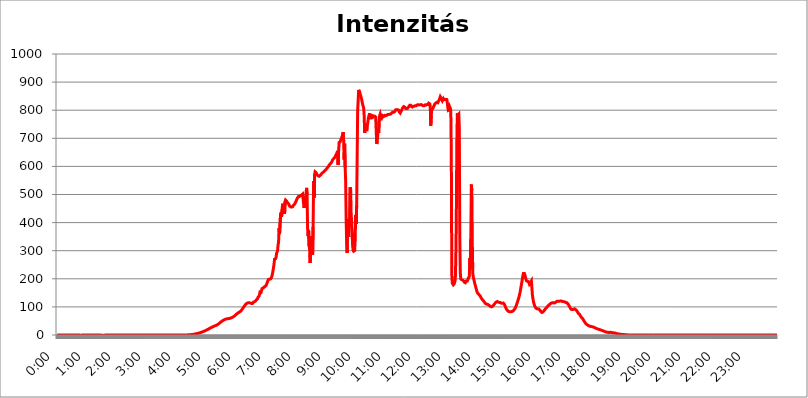
| Category | Intenzitás (W/m2) |
|---|---|
| 0.0 | -0.392 |
| 0.0006944444444444445 | -0.415 |
| 0.001388888888888889 | -0.404 |
| 0.0020833333333333333 | -0.415 |
| 0.002777777777777778 | -0.404 |
| 0.003472222222222222 | -0.381 |
| 0.004166666666666667 | -0.346 |
| 0.004861111111111111 | -0.392 |
| 0.005555555555555556 | -0.335 |
| 0.0062499999999999995 | -0.392 |
| 0.006944444444444444 | -0.415 |
| 0.007638888888888889 | -0.392 |
| 0.008333333333333333 | -0.392 |
| 0.009027777777777779 | -0.358 |
| 0.009722222222222222 | -0.415 |
| 0.010416666666666666 | -0.369 |
| 0.011111111111111112 | -0.404 |
| 0.011805555555555555 | -0.381 |
| 0.012499999999999999 | -0.392 |
| 0.013194444444444444 | -0.404 |
| 0.013888888888888888 | -0.381 |
| 0.014583333333333332 | -0.404 |
| 0.015277777777777777 | -0.427 |
| 0.015972222222222224 | -0.404 |
| 0.016666666666666666 | -0.416 |
| 0.017361111111111112 | -0.45 |
| 0.018055555555555557 | -0.404 |
| 0.01875 | -0.404 |
| 0.019444444444444445 | -0.404 |
| 0.02013888888888889 | -0.416 |
| 0.020833333333333332 | -0.416 |
| 0.02152777777777778 | -0.427 |
| 0.022222222222222223 | -0.404 |
| 0.02291666666666667 | -0.416 |
| 0.02361111111111111 | -0.416 |
| 0.024305555555555556 | -0.427 |
| 0.024999999999999998 | -0.416 |
| 0.025694444444444447 | -0.427 |
| 0.02638888888888889 | -0.439 |
| 0.027083333333333334 | -0.416 |
| 0.027777777777777776 | -0.404 |
| 0.02847222222222222 | -0.427 |
| 0.029166666666666664 | -0.392 |
| 0.029861111111111113 | -0.404 |
| 0.030555555555555555 | -0.427 |
| 0.03125 | -0.462 |
| 0.03194444444444445 | -0.473 |
| 0.03263888888888889 | -0.485 |
| 0.03333333333333333 | -0.462 |
| 0.034027777777777775 | -0.439 |
| 0.034722222222222224 | -0.416 |
| 0.035416666666666666 | -0.404 |
| 0.036111111111111115 | -0.416 |
| 0.03680555555555556 | -0.392 |
| 0.0375 | -0.416 |
| 0.03819444444444444 | -0.404 |
| 0.03888888888888889 | -0.392 |
| 0.03958333333333333 | -0.392 |
| 0.04027777777777778 | -0.392 |
| 0.04097222222222222 | -0.416 |
| 0.041666666666666664 | -0.404 |
| 0.042361111111111106 | -0.381 |
| 0.04305555555555556 | -0.392 |
| 0.043750000000000004 | -0.369 |
| 0.044444444444444446 | -0.416 |
| 0.04513888888888889 | -0.381 |
| 0.04583333333333334 | -0.381 |
| 0.04652777777777778 | -0.392 |
| 0.04722222222222222 | -0.358 |
| 0.04791666666666666 | -0.381 |
| 0.04861111111111111 | -0.369 |
| 0.049305555555555554 | -0.369 |
| 0.049999999999999996 | -0.427 |
| 0.05069444444444445 | -0.392 |
| 0.051388888888888894 | -0.416 |
| 0.052083333333333336 | -0.392 |
| 0.05277777777777778 | -0.404 |
| 0.05347222222222222 | -0.404 |
| 0.05416666666666667 | -0.404 |
| 0.05486111111111111 | -0.392 |
| 0.05555555555555555 | -0.392 |
| 0.05625 | -0.381 |
| 0.05694444444444444 | -0.392 |
| 0.057638888888888885 | -0.381 |
| 0.05833333333333333 | -0.404 |
| 0.05902777777777778 | -0.392 |
| 0.059722222222222225 | -0.427 |
| 0.06041666666666667 | -0.439 |
| 0.061111111111111116 | -0.45 |
| 0.06180555555555556 | -0.462 |
| 0.0625 | -0.519 |
| 0.06319444444444444 | -0.508 |
| 0.06388888888888888 | -0.496 |
| 0.06458333333333334 | -0.473 |
| 0.06527777777777778 | -0.462 |
| 0.06597222222222222 | -0.427 |
| 0.06666666666666667 | -0.439 |
| 0.06736111111111111 | -0.404 |
| 0.06805555555555555 | -0.416 |
| 0.06874999999999999 | -0.462 |
| 0.06944444444444443 | -0.416 |
| 0.07013888888888889 | -0.439 |
| 0.07083333333333333 | -0.404 |
| 0.07152777777777779 | -0.416 |
| 0.07222222222222223 | -0.45 |
| 0.07291666666666667 | -0.45 |
| 0.07361111111111111 | -0.427 |
| 0.07430555555555556 | -0.519 |
| 0.075 | -0.416 |
| 0.07569444444444444 | -0.45 |
| 0.0763888888888889 | -0.45 |
| 0.07708333333333334 | -0.45 |
| 0.07777777777777778 | -0.439 |
| 0.07847222222222222 | -0.427 |
| 0.07916666666666666 | -0.416 |
| 0.0798611111111111 | -0.439 |
| 0.08055555555555556 | -0.404 |
| 0.08125 | -0.45 |
| 0.08194444444444444 | -0.427 |
| 0.08263888888888889 | -0.427 |
| 0.08333333333333333 | -0.427 |
| 0.08402777777777777 | -0.416 |
| 0.08472222222222221 | -0.404 |
| 0.08541666666666665 | -0.404 |
| 0.08611111111111112 | -0.416 |
| 0.08680555555555557 | -0.416 |
| 0.08750000000000001 | -0.427 |
| 0.08819444444444445 | -0.416 |
| 0.08888888888888889 | -0.416 |
| 0.08958333333333333 | -0.427 |
| 0.09027777777777778 | -0.427 |
| 0.09097222222222222 | -0.416 |
| 0.09166666666666667 | -0.416 |
| 0.09236111111111112 | -0.462 |
| 0.09305555555555556 | -0.427 |
| 0.09375 | -0.416 |
| 0.09444444444444444 | -0.416 |
| 0.09513888888888888 | -0.392 |
| 0.09583333333333333 | -0.416 |
| 0.09652777777777777 | -0.416 |
| 0.09722222222222222 | -0.416 |
| 0.09791666666666667 | -0.427 |
| 0.09861111111111111 | -0.427 |
| 0.09930555555555555 | -0.427 |
| 0.09999999999999999 | -0.427 |
| 0.10069444444444443 | -0.439 |
| 0.1013888888888889 | -0.439 |
| 0.10208333333333335 | -0.404 |
| 0.10277777777777779 | -0.416 |
| 0.10347222222222223 | -0.404 |
| 0.10416666666666667 | -0.439 |
| 0.10486111111111111 | -0.427 |
| 0.10555555555555556 | -0.392 |
| 0.10625 | -0.416 |
| 0.10694444444444444 | -0.404 |
| 0.1076388888888889 | -0.358 |
| 0.10833333333333334 | -0.392 |
| 0.10902777777777778 | -0.427 |
| 0.10972222222222222 | -0.369 |
| 0.1111111111111111 | -0.392 |
| 0.11180555555555556 | -0.404 |
| 0.11180555555555556 | -0.416 |
| 0.1125 | -0.439 |
| 0.11319444444444444 | -0.427 |
| 0.11388888888888889 | -0.416 |
| 0.11458333333333333 | -0.335 |
| 0.11527777777777777 | -0.381 |
| 0.11597222222222221 | -0.416 |
| 0.11666666666666665 | -0.369 |
| 0.1173611111111111 | -0.381 |
| 0.11805555555555557 | -0.346 |
| 0.11944444444444445 | -0.358 |
| 0.12013888888888889 | -0.346 |
| 0.12083333333333333 | -0.381 |
| 0.12152777777777778 | -0.358 |
| 0.12222222222222223 | -0.335 |
| 0.12291666666666667 | -0.358 |
| 0.12291666666666667 | -0.381 |
| 0.12361111111111112 | -0.312 |
| 0.12430555555555556 | -0.358 |
| 0.125 | -0.266 |
| 0.12569444444444444 | -0.277 |
| 0.12638888888888888 | -0.3 |
| 0.12708333333333333 | -0.323 |
| 0.16875 | -0.346 |
| 0.12847222222222224 | -0.289 |
| 0.12916666666666668 | -0.335 |
| 0.12986111111111112 | -0.392 |
| 0.13055555555555556 | -0.381 |
| 0.13125 | -0.392 |
| 0.13194444444444445 | -0.369 |
| 0.1326388888888889 | -0.3 |
| 0.13333333333333333 | -0.358 |
| 0.13402777777777777 | -0.369 |
| 0.13402777777777777 | -0.3 |
| 0.13472222222222222 | -0.323 |
| 0.13541666666666666 | -0.289 |
| 0.1361111111111111 | -0.369 |
| 0.13749999999999998 | -0.335 |
| 0.13819444444444443 | -0.323 |
| 0.1388888888888889 | -0.335 |
| 0.13958333333333334 | -0.335 |
| 0.14027777777777778 | -0.335 |
| 0.14097222222222222 | -0.289 |
| 0.14166666666666666 | -0.266 |
| 0.1423611111111111 | -0.3 |
| 0.14305555555555557 | -0.231 |
| 0.14375000000000002 | -0.231 |
| 0.14444444444444446 | -0.277 |
| 0.1451388888888889 | -0.289 |
| 0.1451388888888889 | -0.277 |
| 0.14652777777777778 | -0.254 |
| 0.14722222222222223 | -0.266 |
| 0.14791666666666667 | -0.242 |
| 0.1486111111111111 | -0.231 |
| 0.14930555555555555 | -0.242 |
| 0.15 | -0.242 |
| 0.15069444444444444 | -0.277 |
| 0.15138888888888888 | -0.185 |
| 0.15208333333333332 | -0.219 |
| 0.15277777777777776 | -0.219 |
| 0.15347222222222223 | -0.254 |
| 0.15416666666666667 | -0.162 |
| 0.15486111111111112 | -0.173 |
| 0.15555555555555556 | -0.173 |
| 0.15625 | -0.162 |
| 0.15694444444444444 | -0.15 |
| 0.15763888888888888 | -0.139 |
| 0.15833333333333333 | -0.162 |
| 0.15902777777777777 | -0.208 |
| 0.15972222222222224 | -0.173 |
| 0.16041666666666668 | -0.15 |
| 0.16111111111111112 | -0.185 |
| 0.16180555555555556 | -0.15 |
| 0.1625 | -0.139 |
| 0.16319444444444445 | -0.15 |
| 0.1638888888888889 | -0.173 |
| 0.16458333333333333 | -0.173 |
| 0.16527777777777777 | -0.185 |
| 0.16597222222222222 | -0.139 |
| 0.16666666666666666 | -0.139 |
| 0.1673611111111111 | -0.185 |
| 0.16805555555555554 | -0.15 |
| 0.16874999999999998 | -0.162 |
| 0.16944444444444443 | -0.185 |
| 0.17013888888888887 | -0.127 |
| 0.1708333333333333 | -0.139 |
| 0.17152777777777775 | -0.115 |
| 0.17222222222222225 | -0.104 |
| 0.1729166666666667 | -0.058 |
| 0.17361111111111113 | -0.058 |
| 0.17430555555555557 | -0.023 |
| 0.17500000000000002 | 0.012 |
| 0.17569444444444446 | 0.092 |
| 0.1763888888888889 | 0.046 |
| 0.17708333333333334 | 0.092 |
| 0.17777777777777778 | 0.104 |
| 0.17847222222222223 | 0.219 |
| 0.17916666666666667 | 0.3 |
| 0.1798611111111111 | 0.392 |
| 0.18055555555555555 | 0.416 |
| 0.18125 | 0.508 |
| 0.18194444444444444 | 0.67 |
| 0.1826388888888889 | 0.762 |
| 0.18333333333333335 | 0.831 |
| 0.1840277777777778 | 1.004 |
| 0.18472222222222223 | 1.154 |
| 0.18541666666666667 | 1.304 |
| 0.18611111111111112 | 1.512 |
| 0.18680555555555556 | 1.674 |
| 0.1875 | 1.939 |
| 0.18819444444444444 | 2.274 |
| 0.18888888888888888 | 2.505 |
| 0.18958333333333333 | 2.863 |
| 0.19027777777777777 | 3.117 |
| 0.1909722222222222 | 3.44 |
| 0.19166666666666665 | 3.844 |
| 0.19236111111111112 | 4.19 |
| 0.19305555555555554 | 4.618 |
| 0.19375 | 5.079 |
| 0.19444444444444445 | 5.46 |
| 0.1951388888888889 | 5.934 |
| 0.19583333333333333 | 6.43 |
| 0.19652777777777777 | 6.972 |
| 0.19722222222222222 | 7.492 |
| 0.19791666666666666 | 8.069 |
| 0.1986111111111111 | 8.623 |
| 0.19930555555555554 | 9.235 |
| 0.19999999999999998 | 9.847 |
| 0.20069444444444443 | 10.528 |
| 0.20138888888888887 | 11.221 |
| 0.2020833333333333 | 11.833 |
| 0.2027777777777778 | 12.583 |
| 0.2034722222222222 | 13.299 |
| 0.2041666666666667 | 14.072 |
| 0.20486111111111113 | 14.822 |
| 0.20555555555555557 | 15.677 |
| 0.20625000000000002 | 16.542 |
| 0.20694444444444446 | 17.385 |
| 0.2076388888888889 | 18.274 |
| 0.20833333333333334 | 19.186 |
| 0.20902777777777778 | 20.19 |
| 0.20972222222222223 | 21.218 |
| 0.21041666666666667 | 22.211 |
| 0.2111111111111111 | 23.203 |
| 0.21180555555555555 | 24.173 |
| 0.2125 | 25.166 |
| 0.21319444444444444 | 26.089 |
| 0.2138888888888889 | 26.978 |
| 0.21458333333333335 | 27.879 |
| 0.2152777777777778 | 28.791 |
| 0.21597222222222223 | 29.668 |
| 0.21666666666666667 | 30.511 |
| 0.21736111111111112 | 31.215 |
| 0.21805555555555556 | 31.954 |
| 0.21875 | 32.704 |
| 0.21944444444444444 | 33.408 |
| 0.22013888888888888 | 34.089 |
| 0.22083333333333333 | 34.944 |
| 0.22152777777777777 | 35.798 |
| 0.2222222222222222 | 36.825 |
| 0.22291666666666665 | 37.968 |
| 0.2236111111111111 | 39.203 |
| 0.22430555555555556 | 40.577 |
| 0.225 | 42.101 |
| 0.22569444444444445 | 43.625 |
| 0.2263888888888889 | 45.195 |
| 0.22708333333333333 | 46.696 |
| 0.22777777777777777 | 48.104 |
| 0.22847222222222222 | 49.432 |
| 0.22916666666666666 | 50.574 |
| 0.2298611111111111 | 51.671 |
| 0.23055555555555554 | 52.583 |
| 0.23124999999999998 | 53.529 |
| 0.23194444444444443 | 54.487 |
| 0.23263888888888887 | 55.411 |
| 0.2333333333333333 | 56.184 |
| 0.2340277777777778 | 56.9 |
| 0.2347222222222222 | 57.35 |
| 0.2354166666666667 | 57.719 |
| 0.23611111111111113 | 57.972 |
| 0.23680555555555557 | 58.238 |
| 0.23750000000000002 | 58.457 |
| 0.23819444444444446 | 58.665 |
| 0.2388888888888889 | 58.953 |
| 0.23958333333333334 | 59.346 |
| 0.24027777777777778 | 59.888 |
| 0.24097222222222223 | 60.673 |
| 0.24166666666666667 | 61.492 |
| 0.2423611111111111 | 62.254 |
| 0.24305555555555555 | 63.121 |
| 0.24375 | 64.067 |
| 0.24444444444444446 | 65.106 |
| 0.24513888888888888 | 66.202 |
| 0.24583333333333335 | 67.575 |
| 0.2465277777777778 | 69.203 |
| 0.24722222222222223 | 70.865 |
| 0.24791666666666667 | 72.515 |
| 0.24861111111111112 | 74.212 |
| 0.24930555555555556 | 75.782 |
| 0.25 | 77.11 |
| 0.25069444444444444 | 78.299 |
| 0.2513888888888889 | 79.476 |
| 0.2520833333333333 | 80.722 |
| 0.25277777777777777 | 81.946 |
| 0.2534722222222222 | 83.193 |
| 0.25416666666666665 | 84.59 |
| 0.2548611111111111 | 86.321 |
| 0.2555555555555556 | 88.329 |
| 0.25625000000000003 | 90.696 |
| 0.2569444444444445 | 93.258 |
| 0.2576388888888889 | 95.936 |
| 0.25833333333333336 | 98.51 |
| 0.2590277777777778 | 101.06 |
| 0.25972222222222224 | 103.53 |
| 0.2604166666666667 | 105.97 |
| 0.2611111111111111 | 108.18 |
| 0.26180555555555557 | 110.24 |
| 0.2625 | 111.91 |
| 0.26319444444444445 | 113.15 |
| 0.2638888888888889 | 114.02 |
| 0.26458333333333334 | 114.48 |
| 0.2652777777777778 | 114.68 |
| 0.2659722222222222 | 115.07 |
| 0.26666666666666666 | 114.47 |
| 0.2673611111111111 | 113.83 |
| 0.26805555555555555 | 113.33 |
| 0.26875 | 112.76 |
| 0.26944444444444443 | 112.28 |
| 0.2701388888888889 | 112.09 |
| 0.2708333333333333 | 112.46 |
| 0.27152777777777776 | 113.74 |
| 0.2722222222222222 | 117.12 |
| 0.27291666666666664 | 118.88 |
| 0.2736111111111111 | 118.34 |
| 0.2743055555555555 | 119.53 |
| 0.27499999999999997 | 121.21 |
| 0.27569444444444446 | 123.64 |
| 0.27638888888888885 | 125.64 |
| 0.27708333333333335 | 126.63 |
| 0.2777777777777778 | 128.64 |
| 0.27847222222222223 | 134.72 |
| 0.2791666666666667 | 135.64 |
| 0.2798611111111111 | 137.87 |
| 0.28055555555555556 | 144.87 |
| 0.28125 | 152.84 |
| 0.28194444444444444 | 150.32 |
| 0.2826388888888889 | 151.5 |
| 0.2833333333333333 | 157.41 |
| 0.28402777777777777 | 165.34 |
| 0.2847222222222222 | 167.02 |
| 0.28541666666666665 | 166.76 |
| 0.28611111111111115 | 169.05 |
| 0.28680555555555554 | 170.54 |
| 0.28750000000000003 | 171.5 |
| 0.2881944444444445 | 172.61 |
| 0.2888888888888889 | 173.99 |
| 0.28958333333333336 | 176.02 |
| 0.2902777777777778 | 179.93 |
| 0.29097222222222224 | 185.04 |
| 0.2916666666666667 | 189.7 |
| 0.2923611111111111 | 193.73 |
| 0.29305555555555557 | 198.02 |
| 0.29375 | 199.06 |
| 0.29444444444444445 | 198.76 |
| 0.2951388888888889 | 198.82 |
| 0.29583333333333334 | 199.52 |
| 0.2965277777777778 | 201.4 |
| 0.2972222222222222 | 205.14 |
| 0.29791666666666666 | 211.31 |
| 0.2986111111111111 | 219.38 |
| 0.29930555555555555 | 230.4 |
| 0.3 | 240.1 |
| 0.30069444444444443 | 253.3 |
| 0.3013888888888889 | 270 |
| 0.3020833333333333 | 272.04 |
| 0.30277777777777776 | 271.42 |
| 0.3034722222222222 | 275.51 |
| 0.30416666666666664 | 290.44 |
| 0.3048611111111111 | 294.91 |
| 0.3055555555555555 | 299.32 |
| 0.30624999999999997 | 320.27 |
| 0.3069444444444444 | 329.51 |
| 0.3076388888888889 | 379.46 |
| 0.30833333333333335 | 358.89 |
| 0.3090277777777778 | 355.39 |
| 0.30972222222222223 | 428.57 |
| 0.3104166666666667 | 436.03 |
| 0.3111111111111111 | 420.45 |
| 0.31180555555555556 | 446.61 |
| 0.3125 | 463.15 |
| 0.31319444444444444 | 463.1 |
| 0.3138888888888889 | 462.56 |
| 0.3145833333333333 | 449.44 |
| 0.31527777777777777 | 430.81 |
| 0.3159722222222222 | 474.76 |
| 0.31666666666666665 | 480.55 |
| 0.31736111111111115 | 477.4 |
| 0.31805555555555554 | 476.95 |
| 0.31875000000000003 | 474.49 |
| 0.3194444444444445 | 470.53 |
| 0.3201388888888889 | 469.17 |
| 0.32083333333333336 | 466.94 |
| 0.3215277777777778 | 463.12 |
| 0.32222222222222224 | 458.97 |
| 0.3229166666666667 | 457.09 |
| 0.3236111111111111 | 456.13 |
| 0.32430555555555557 | 455.9 |
| 0.325 | 455.19 |
| 0.32569444444444445 | 455.46 |
| 0.3263888888888889 | 456.52 |
| 0.32708333333333334 | 460.28 |
| 0.3277777777777778 | 461.9 |
| 0.3284722222222222 | 463.36 |
| 0.32916666666666666 | 465.42 |
| 0.3298611111111111 | 468.73 |
| 0.33055555555555555 | 471.76 |
| 0.33125 | 476.09 |
| 0.33194444444444443 | 481.24 |
| 0.3326388888888889 | 484.31 |
| 0.3333333333333333 | 488.85 |
| 0.3340277777777778 | 491.82 |
| 0.3347222222222222 | 492.97 |
| 0.3354166666666667 | 493.38 |
| 0.3361111111111111 | 493.22 |
| 0.3368055555555556 | 494.98 |
| 0.33749999999999997 | 496.55 |
| 0.33819444444444446 | 497.66 |
| 0.33888888888888885 | 498.27 |
| 0.33958333333333335 | 500.15 |
| 0.34027777777777773 | 501.49 |
| 0.34097222222222223 | 499.98 |
| 0.3416666666666666 | 467.49 |
| 0.3423611111111111 | 452.17 |
| 0.3430555555555555 | 465.54 |
| 0.34375 | 483.03 |
| 0.3444444444444445 | 492.57 |
| 0.3451388888888889 | 505.97 |
| 0.3458333333333334 | 523.56 |
| 0.34652777777777777 | 498.74 |
| 0.34722222222222227 | 379.48 |
| 0.34791666666666665 | 352.05 |
| 0.34861111111111115 | 374 |
| 0.34930555555555554 | 317.28 |
| 0.35000000000000003 | 305.08 |
| 0.3506944444444444 | 255.99 |
| 0.3513888888888889 | 301.9 |
| 0.3520833333333333 | 351.03 |
| 0.3527777777777778 | 310.83 |
| 0.3534722222222222 | 296.34 |
| 0.3541666666666667 | 285.21 |
| 0.3548611111111111 | 384.57 |
| 0.35555555555555557 | 548.06 |
| 0.35625 | 488.7 |
| 0.35694444444444445 | 569.87 |
| 0.3576388888888889 | 580.86 |
| 0.35833333333333334 | 581.77 |
| 0.3590277777777778 | 577.94 |
| 0.3597222222222222 | 573.83 |
| 0.36041666666666666 | 569.72 |
| 0.3611111111111111 | 568.73 |
| 0.36180555555555555 | 566.53 |
| 0.3625 | 565.66 |
| 0.36319444444444443 | 564.88 |
| 0.3638888888888889 | 565.95 |
| 0.3645833333333333 | 568.12 |
| 0.3652777777777778 | 570.16 |
| 0.3659722222222222 | 571.95 |
| 0.3666666666666667 | 573.47 |
| 0.3673611111111111 | 575.71 |
| 0.3680555555555556 | 577.52 |
| 0.36874999999999997 | 579.08 |
| 0.36944444444444446 | 580.39 |
| 0.37013888888888885 | 582.05 |
| 0.37083333333333335 | 583.99 |
| 0.37152777777777773 | 585.44 |
| 0.37222222222222223 | 587.41 |
| 0.3729166666666666 | 589.54 |
| 0.3736111111111111 | 592.21 |
| 0.3743055555555555 | 594.38 |
| 0.375 | 596.27 |
| 0.3756944444444445 | 598.24 |
| 0.3763888888888889 | 600.71 |
| 0.3770833333333334 | 604.32 |
| 0.37777777777777777 | 607.32 |
| 0.37847222222222227 | 608.68 |
| 0.37916666666666665 | 610.28 |
| 0.37986111111111115 | 612.41 |
| 0.38055555555555554 | 614.86 |
| 0.38125000000000003 | 618.43 |
| 0.3819444444444444 | 623.18 |
| 0.3826388888888889 | 626.02 |
| 0.3833333333333333 | 627.56 |
| 0.3840277777777778 | 629.48 |
| 0.3847222222222222 | 631.42 |
| 0.3854166666666667 | 635.08 |
| 0.3861111111111111 | 638.91 |
| 0.38680555555555557 | 641.17 |
| 0.3875 | 644.99 |
| 0.38819444444444445 | 648.03 |
| 0.3888888888888889 | 655.29 |
| 0.38958333333333334 | 605.32 |
| 0.3902777777777778 | 656.46 |
| 0.3909722222222222 | 685.35 |
| 0.39166666666666666 | 688.15 |
| 0.3923611111111111 | 686.8 |
| 0.39305555555555555 | 693.53 |
| 0.39375 | 697.72 |
| 0.39444444444444443 | 702.09 |
| 0.3951388888888889 | 707.05 |
| 0.3958333333333333 | 714.28 |
| 0.3965277777777778 | 722.13 |
| 0.3972222222222222 | 692.13 |
| 0.3979166666666667 | 623.55 |
| 0.3986111111111111 | 680.8 |
| 0.3993055555555556 | 595.94 |
| 0.39999999999999997 | 548.93 |
| 0.40069444444444446 | 412.51 |
| 0.40138888888888885 | 325.88 |
| 0.40208333333333335 | 291.73 |
| 0.40277777777777773 | 408.77 |
| 0.40347222222222223 | 413.18 |
| 0.4041666666666666 | 349.59 |
| 0.4048611111111111 | 410.23 |
| 0.4055555555555555 | 384.03 |
| 0.40625 | 525.32 |
| 0.4069444444444445 | 517.41 |
| 0.4076388888888889 | 429.71 |
| 0.4083333333333334 | 405.59 |
| 0.40902777777777777 | 361.99 |
| 0.40972222222222227 | 316.04 |
| 0.41041666666666665 | 302.13 |
| 0.41111111111111115 | 298.26 |
| 0.41180555555555554 | 301.35 |
| 0.41250000000000003 | 300.67 |
| 0.4131944444444444 | 335.1 |
| 0.4138888888888889 | 427.42 |
| 0.4145833333333333 | 395.15 |
| 0.4152777777777778 | 459.97 |
| 0.4159722222222222 | 635.24 |
| 0.4166666666666667 | 799.5 |
| 0.4173611111111111 | 800.08 |
| 0.41805555555555557 | 872.16 |
| 0.41875 | 869.44 |
| 0.41944444444444445 | 864.06 |
| 0.4201388888888889 | 858.21 |
| 0.42083333333333334 | 851.7 |
| 0.4215277777777778 | 845.03 |
| 0.4222222222222222 | 838.22 |
| 0.42291666666666666 | 829.25 |
| 0.4236111111111111 | 820.07 |
| 0.42430555555555555 | 813.96 |
| 0.425 | 807.07 |
| 0.42569444444444443 | 780.69 |
| 0.4263888888888889 | 718.67 |
| 0.4270833333333333 | 751.36 |
| 0.4277777777777778 | 752.85 |
| 0.4284722222222222 | 733.13 |
| 0.4291666666666667 | 725.64 |
| 0.4298611111111111 | 743.29 |
| 0.4305555555555556 | 752.89 |
| 0.43124999999999997 | 766.23 |
| 0.43194444444444446 | 777.62 |
| 0.43263888888888885 | 783.37 |
| 0.43333333333333335 | 789.17 |
| 0.43402777777777773 | 768.24 |
| 0.43472222222222223 | 775.03 |
| 0.4354166666666666 | 784.92 |
| 0.4361111111111111 | 778.33 |
| 0.4368055555555555 | 776.56 |
| 0.4375 | 774.84 |
| 0.4381944444444445 | 776.6 |
| 0.4388888888888889 | 779.49 |
| 0.4395833333333334 | 780.25 |
| 0.44027777777777777 | 778.69 |
| 0.44097222222222227 | 777.32 |
| 0.44166666666666665 | 775.6 |
| 0.44236111111111115 | 729.5 |
| 0.44305555555555554 | 679.79 |
| 0.44375000000000003 | 688.37 |
| 0.4444444444444444 | 708.99 |
| 0.4451388888888889 | 730.92 |
| 0.4458333333333333 | 720.22 |
| 0.4465277777777778 | 766.76 |
| 0.4472222222222222 | 780.59 |
| 0.4479166666666667 | 786.01 |
| 0.4486111111111111 | 777.78 |
| 0.44930555555555557 | 776.4 |
| 0.45 | 771.96 |
| 0.45069444444444445 | 776.12 |
| 0.4513888888888889 | 780.62 |
| 0.45208333333333334 | 779.82 |
| 0.4527777777777778 | 777.78 |
| 0.4534722222222222 | 777.72 |
| 0.45416666666666666 | 781.41 |
| 0.4548611111111111 | 781.91 |
| 0.45555555555555555 | 780.5 |
| 0.45625 | 780.87 |
| 0.45694444444444443 | 782.14 |
| 0.4576388888888889 | 784.34 |
| 0.4583333333333333 | 784.57 |
| 0.4590277777777778 | 783.77 |
| 0.4597222222222222 | 784.94 |
| 0.4604166666666667 | 785.03 |
| 0.4611111111111111 | 785.42 |
| 0.4618055555555556 | 785.59 |
| 0.46249999999999997 | 786.04 |
| 0.46319444444444446 | 786.61 |
| 0.46388888888888885 | 789.74 |
| 0.46458333333333335 | 793.1 |
| 0.46527777777777773 | 793.08 |
| 0.46597222222222223 | 792.46 |
| 0.4666666666666666 | 792.54 |
| 0.4673611111111111 | 793.38 |
| 0.4680555555555555 | 795.24 |
| 0.46875 | 798.11 |
| 0.4694444444444445 | 801.7 |
| 0.4701388888888889 | 801.58 |
| 0.4708333333333334 | 801.48 |
| 0.47152777777777777 | 802.11 |
| 0.47222222222222227 | 802.02 |
| 0.47291666666666665 | 801.51 |
| 0.47361111111111115 | 799.92 |
| 0.47430555555555554 | 794.01 |
| 0.47500000000000003 | 790.57 |
| 0.4756944444444444 | 789.81 |
| 0.4763888888888889 | 792.53 |
| 0.4770833333333333 | 797.52 |
| 0.4777777777777778 | 801.25 |
| 0.4784722222222222 | 804.28 |
| 0.4791666666666667 | 808.77 |
| 0.4798611111111111 | 811.24 |
| 0.48055555555555557 | 812.92 |
| 0.48125 | 812.39 |
| 0.48194444444444445 | 810.69 |
| 0.4826388888888889 | 807.98 |
| 0.48333333333333334 | 806.24 |
| 0.4840277777777778 | 804.72 |
| 0.4847222222222222 | 805.8 |
| 0.48541666666666666 | 807 |
| 0.4861111111111111 | 806.97 |
| 0.48680555555555555 | 809.04 |
| 0.4875 | 812.27 |
| 0.48819444444444443 | 814.8 |
| 0.4888888888888889 | 817.65 |
| 0.4895833333333333 | 817.63 |
| 0.4902777777777778 | 817.6 |
| 0.4909722222222222 | 813.66 |
| 0.4916666666666667 | 810.84 |
| 0.4923611111111111 | 811.22 |
| 0.4930555555555556 | 813.18 |
| 0.49374999999999997 | 813.93 |
| 0.49444444444444446 | 813.73 |
| 0.49513888888888885 | 813.94 |
| 0.49583333333333335 | 814.35 |
| 0.49652777777777773 | 815.96 |
| 0.49722222222222223 | 815.56 |
| 0.4979166666666666 | 815.76 |
| 0.4986111111111111 | 817.25 |
| 0.4993055555555555 | 818.91 |
| 0.5 | 819.7 |
| 0.5006944444444444 | 819.3 |
| 0.5013888888888889 | 818.92 |
| 0.5020833333333333 | 818.78 |
| 0.5027777777777778 | 818.79 |
| 0.5034722222222222 | 819.42 |
| 0.5041666666666667 | 819.71 |
| 0.5048611111111111 | 820.1 |
| 0.5055555555555555 | 819.04 |
| 0.50625 | 817.35 |
| 0.5069444444444444 | 817.28 |
| 0.5076388888888889 | 815.6 |
| 0.5083333333333333 | 814.51 |
| 0.5090277777777777 | 816.06 |
| 0.5097222222222222 | 818.35 |
| 0.5104166666666666 | 819.09 |
| 0.5111111111111112 | 819.75 |
| 0.5118055555555555 | 818.44 |
| 0.5125000000000001 | 820.34 |
| 0.5131944444444444 | 820.62 |
| 0.513888888888889 | 819.52 |
| 0.5145833333333333 | 820.04 |
| 0.5152777777777778 | 824.86 |
| 0.5159722222222222 | 823.76 |
| 0.5166666666666667 | 822.51 |
| 0.517361111111111 | 813.27 |
| 0.5180555555555556 | 744.58 |
| 0.5187499999999999 | 782.14 |
| 0.5194444444444445 | 802.27 |
| 0.5201388888888888 | 803.76 |
| 0.5208333333333334 | 805.71 |
| 0.5215277777777778 | 809.83 |
| 0.5222222222222223 | 813.52 |
| 0.5229166666666667 | 817.88 |
| 0.5236111111111111 | 822.05 |
| 0.5243055555555556 | 824.14 |
| 0.525 | 825.2 |
| 0.5256944444444445 | 826.64 |
| 0.5263888888888889 | 828.03 |
| 0.5270833333333333 | 828.37 |
| 0.5277777777777778 | 826.51 |
| 0.5284722222222222 | 829.5 |
| 0.5291666666666667 | 833.84 |
| 0.5298611111111111 | 837.7 |
| 0.5305555555555556 | 842.62 |
| 0.53125 | 847.99 |
| 0.5319444444444444 | 844.76 |
| 0.5326388888888889 | 841.27 |
| 0.5333333333333333 | 839.7 |
| 0.5340277777777778 | 833.69 |
| 0.5347222222222222 | 836.23 |
| 0.5354166666666667 | 840.9 |
| 0.5361111111111111 | 837.31 |
| 0.5368055555555555 | 839.74 |
| 0.5375 | 838.22 |
| 0.5381944444444444 | 835.55 |
| 0.5388888888888889 | 838.79 |
| 0.5395833333333333 | 840.92 |
| 0.5402777777777777 | 838 |
| 0.5409722222222222 | 828.58 |
| 0.5416666666666666 | 810.35 |
| 0.5423611111111112 | 799.53 |
| 0.5430555555555555 | 802.5 |
| 0.5437500000000001 | 801.19 |
| 0.5444444444444444 | 811.41 |
| 0.545138888888889 | 807.37 |
| 0.5458333333333333 | 798.75 |
| 0.5465277777777778 | 650.01 |
| 0.5472222222222222 | 214.75 |
| 0.5479166666666667 | 184.16 |
| 0.548611111111111 | 183.13 |
| 0.5493055555555556 | 178.53 |
| 0.5499999999999999 | 179.1 |
| 0.5506944444444445 | 182.82 |
| 0.5513888888888888 | 188.54 |
| 0.5520833333333334 | 197.18 |
| 0.5527777777777778 | 272.38 |
| 0.5534722222222223 | 405.87 |
| 0.5541666666666667 | 682.76 |
| 0.5548611111111111 | 789.22 |
| 0.5555555555555556 | 782.72 |
| 0.55625 | 785.63 |
| 0.5569444444444445 | 786.6 |
| 0.5576388888888889 | 740.39 |
| 0.5583333333333333 | 338.72 |
| 0.5590277777777778 | 222.08 |
| 0.5597222222222222 | 198.87 |
| 0.5604166666666667 | 200.05 |
| 0.5611111111111111 | 196.72 |
| 0.5618055555555556 | 194.23 |
| 0.5625 | 194.85 |
| 0.5631944444444444 | 195.09 |
| 0.5638888888888889 | 191.86 |
| 0.5645833333333333 | 187.64 |
| 0.5652777777777778 | 184.62 |
| 0.5659722222222222 | 185.82 |
| 0.5666666666666667 | 188.93 |
| 0.5673611111111111 | 192.24 |
| 0.5680555555555555 | 191.99 |
| 0.56875 | 192.25 |
| 0.5694444444444444 | 196.86 |
| 0.5701388888888889 | 202.27 |
| 0.5708333333333333 | 203.81 |
| 0.5715277777777777 | 208.38 |
| 0.5722222222222222 | 272.97 |
| 0.5729166666666666 | 234.19 |
| 0.5736111111111112 | 340.72 |
| 0.5743055555555555 | 535.61 |
| 0.5750000000000001 | 512.98 |
| 0.5756944444444444 | 324.84 |
| 0.576388888888889 | 218.26 |
| 0.5770833333333333 | 205.1 |
| 0.5777777777777778 | 198.41 |
| 0.5784722222222222 | 189.85 |
| 0.5791666666666667 | 182.71 |
| 0.579861111111111 | 176.55 |
| 0.5805555555555556 | 169.3 |
| 0.5812499999999999 | 162.52 |
| 0.5819444444444445 | 156.32 |
| 0.5826388888888888 | 150.77 |
| 0.5833333333333334 | 147.89 |
| 0.5840277777777778 | 146.42 |
| 0.5847222222222223 | 144.88 |
| 0.5854166666666667 | 142.35 |
| 0.5861111111111111 | 140.31 |
| 0.5868055555555556 | 138.05 |
| 0.5875 | 134.5 |
| 0.5881944444444445 | 130.86 |
| 0.5888888888888889 | 127.92 |
| 0.5895833333333333 | 126.18 |
| 0.5902777777777778 | 124.06 |
| 0.5909722222222222 | 121.75 |
| 0.5916666666666667 | 119.6 |
| 0.5923611111111111 | 117.43 |
| 0.5930555555555556 | 115 |
| 0.59375 | 112.36 |
| 0.5944444444444444 | 110.79 |
| 0.5951388888888889 | 110.16 |
| 0.5958333333333333 | 109.85 |
| 0.5965277777777778 | 109.33 |
| 0.5972222222222222 | 108.48 |
| 0.5979166666666667 | 107.53 |
| 0.5986111111111111 | 106.2 |
| 0.5993055555555555 | 104.77 |
| 0.6 | 103.41 |
| 0.6006944444444444 | 101.92 |
| 0.6013888888888889 | 100.74 |
| 0.6020833333333333 | 100.31 |
| 0.6027777777777777 | 100.66 |
| 0.6034722222222222 | 101.54 |
| 0.6041666666666666 | 102.92 |
| 0.6048611111111112 | 105.13 |
| 0.6055555555555555 | 107.53 |
| 0.6062500000000001 | 109.71 |
| 0.6069444444444444 | 111.88 |
| 0.607638888888889 | 114.1 |
| 0.6083333333333333 | 116 |
| 0.6090277777777778 | 117.6 |
| 0.6097222222222222 | 118.72 |
| 0.6104166666666667 | 119.09 |
| 0.611111111111111 | 118.15 |
| 0.6118055555555556 | 116.62 |
| 0.6124999999999999 | 115.93 |
| 0.6131944444444445 | 115.89 |
| 0.6138888888888888 | 115.79 |
| 0.6145833333333334 | 115.59 |
| 0.6152777777777778 | 114.15 |
| 0.6159722222222223 | 113.3 |
| 0.6166666666666667 | 112.92 |
| 0.6173611111111111 | 113.07 |
| 0.6180555555555556 | 113.45 |
| 0.61875 | 113.61 |
| 0.6194444444444445 | 112.87 |
| 0.6201388888888889 | 109.4 |
| 0.6208333333333333 | 105.3 |
| 0.6215277777777778 | 100.67 |
| 0.6222222222222222 | 96.287 |
| 0.6229166666666667 | 92.6 |
| 0.6236111111111111 | 89.616 |
| 0.6243055555555556 | 87.335 |
| 0.625 | 85.55 |
| 0.6256944444444444 | 84.214 |
| 0.6263888888888889 | 83.42 |
| 0.6270833333333333 | 82.937 |
| 0.6277777777777778 | 82.73 |
| 0.6284722222222222 | 82.765 |
| 0.6291666666666667 | 82.985 |
| 0.6298611111111111 | 83.078 |
| 0.6305555555555555 | 83.298 |
| 0.63125 | 84.059 |
| 0.6319444444444444 | 85.432 |
| 0.6326388888888889 | 86.862 |
| 0.6333333333333333 | 88.799 |
| 0.6340277777777777 | 91.209 |
| 0.6347222222222222 | 93.641 |
| 0.6354166666666666 | 96.777 |
| 0.6361111111111112 | 101.19 |
| 0.6368055555555555 | 106.2 |
| 0.6375000000000001 | 111.65 |
| 0.6381944444444444 | 116.83 |
| 0.638888888888889 | 122.31 |
| 0.6395833333333333 | 128.16 |
| 0.6402777777777778 | 134.13 |
| 0.6409722222222222 | 141.16 |
| 0.6416666666666667 | 149.22 |
| 0.642361111111111 | 158.16 |
| 0.6430555555555556 | 168.56 |
| 0.6437499999999999 | 179.28 |
| 0.6444444444444445 | 189.35 |
| 0.6451388888888888 | 199.8 |
| 0.6458333333333334 | 210.76 |
| 0.6465277777777778 | 219.07 |
| 0.6472222222222223 | 220.74 |
| 0.6479166666666667 | 218.99 |
| 0.6486111111111111 | 215.8 |
| 0.6493055555555556 | 207.21 |
| 0.65 | 198.92 |
| 0.6506944444444445 | 193.29 |
| 0.6513888888888889 | 190.9 |
| 0.6520833333333333 | 190.95 |
| 0.6527777777777778 | 191.55 |
| 0.6534722222222222 | 190.05 |
| 0.6541666666666667 | 186.19 |
| 0.6548611111111111 | 180.91 |
| 0.6555555555555556 | 179.35 |
| 0.65625 | 185.51 |
| 0.6569444444444444 | 188.14 |
| 0.6576388888888889 | 192.2 |
| 0.6583333333333333 | 167.62 |
| 0.6590277777777778 | 142.54 |
| 0.6597222222222222 | 129.92 |
| 0.6604166666666667 | 119.8 |
| 0.6611111111111111 | 112.47 |
| 0.6618055555555555 | 106.6 |
| 0.6625 | 101.7 |
| 0.6631944444444444 | 98.208 |
| 0.6638888888888889 | 95.649 |
| 0.6645833333333333 | 94.07 |
| 0.6652777777777777 | 93.47 |
| 0.6659722222222222 | 93.182 |
| 0.6666666666666666 | 93.009 |
| 0.6673611111111111 | 92.733 |
| 0.6680555555555556 | 92.169 |
| 0.6687500000000001 | 90.866 |
| 0.6694444444444444 | 88.561 |
| 0.6701388888888888 | 85.829 |
| 0.6708333333333334 | 83.247 |
| 0.6715277777777778 | 81.068 |
| 0.6722222222222222 | 80.065 |
| 0.6729166666666666 | 80.503 |
| 0.6736111111111112 | 81.853 |
| 0.6743055555555556 | 83.64 |
| 0.6749999999999999 | 85.819 |
| 0.6756944444444444 | 88.39 |
| 0.6763888888888889 | 91.077 |
| 0.6770833333333334 | 93.43 |
| 0.6777777777777777 | 95.113 |
| 0.6784722222222223 | 96.647 |
| 0.6791666666666667 | 98.814 |
| 0.6798611111111111 | 101.55 |
| 0.6805555555555555 | 103.81 |
| 0.68125 | 104.95 |
| 0.6819444444444445 | 106.25 |
| 0.6826388888888889 | 108.2 |
| 0.6833333333333332 | 110.25 |
| 0.6840277777777778 | 111.59 |
| 0.6847222222222222 | 112.67 |
| 0.6854166666666667 | 113.5 |
| 0.686111111111111 | 114.23 |
| 0.6868055555555556 | 115.01 |
| 0.6875 | 115.17 |
| 0.6881944444444444 | 114.64 |
| 0.688888888888889 | 113.71 |
| 0.6895833333333333 | 113.56 |
| 0.6902777777777778 | 114.54 |
| 0.6909722222222222 | 115.97 |
| 0.6916666666666668 | 117.5 |
| 0.6923611111111111 | 118.89 |
| 0.6930555555555555 | 119.81 |
| 0.69375 | 119.99 |
| 0.6944444444444445 | 119.95 |
| 0.6951388888888889 | 119.93 |
| 0.6958333333333333 | 120.1 |
| 0.6965277777777777 | 120.25 |
| 0.6972222222222223 | 120.63 |
| 0.6979166666666666 | 121.21 |
| 0.6986111111111111 | 121.36 |
| 0.6993055555555556 | 120.47 |
| 0.7000000000000001 | 120.15 |
| 0.7006944444444444 | 119.8 |
| 0.7013888888888888 | 118.87 |
| 0.7020833333333334 | 118.42 |
| 0.7027777777777778 | 118.67 |
| 0.7034722222222222 | 118.35 |
| 0.7041666666666666 | 117.29 |
| 0.7048611111111112 | 116.35 |
| 0.7055555555555556 | 115.51 |
| 0.7062499999999999 | 114.99 |
| 0.7069444444444444 | 114.65 |
| 0.7076388888888889 | 113.27 |
| 0.7083333333333334 | 110.63 |
| 0.7090277777777777 | 107.95 |
| 0.7097222222222223 | 105.04 |
| 0.7104166666666667 | 102.24 |
| 0.7111111111111111 | 98.549 |
| 0.7118055555555555 | 94.295 |
| 0.7125 | 91.585 |
| 0.7131944444444445 | 90.582 |
| 0.7138888888888889 | 90.444 |
| 0.7145833333333332 | 90.547 |
| 0.7152777777777778 | 90.766 |
| 0.7159722222222222 | 91.377 |
| 0.7166666666666667 | 92.623 |
| 0.717361111111111 | 93.142 |
| 0.7180555555555556 | 92.576 |
| 0.71875 | 91.02 |
| 0.7194444444444444 | 89.151 |
| 0.720138888888889 | 87.306 |
| 0.7208333333333333 | 85.116 |
| 0.7215277777777778 | 82.452 |
| 0.7222222222222222 | 79.292 |
| 0.7229166666666668 | 76.456 |
| 0.7236111111111111 | 74.415 |
| 0.7243055555555555 | 73.724 |
| 0.725 | 71.36 |
| 0.7256944444444445 | 67.761 |
| 0.7263888888888889 | 64.867 |
| 0.7270833333333333 | 62.757 |
| 0.7277777777777777 | 61.062 |
| 0.7284722222222223 | 59.24 |
| 0.7291666666666666 | 56.426 |
| 0.7298611111111111 | 53.44 |
| 0.7305555555555556 | 50.315 |
| 0.7312500000000001 | 47.489 |
| 0.7319444444444444 | 44.768 |
| 0.7326388888888888 | 42.139 |
| 0.7333333333333334 | 39.844 |
| 0.7340277777777778 | 38.045 |
| 0.7347222222222222 | 36.696 |
| 0.7354166666666666 | 35.716 |
| 0.7361111111111112 | 34.724 |
| 0.7368055555555556 | 33.71 |
| 0.7374999999999999 | 32.568 |
| 0.7381944444444444 | 31.599 |
| 0.7388888888888889 | 31.057 |
| 0.7395833333333334 | 30.688 |
| 0.7402777777777777 | 30.25 |
| 0.7409722222222223 | 30.054 |
| 0.7416666666666667 | 29.881 |
| 0.7423611111111111 | 29.328 |
| 0.7430555555555555 | 28.74 |
| 0.74375 | 28.163 |
| 0.7444444444444445 | 27.494 |
| 0.7451388888888889 | 26.629 |
| 0.7458333333333332 | 25.707 |
| 0.7465277777777778 | 24.854 |
| 0.7472222222222222 | 23.954 |
| 0.7479166666666667 | 23.101 |
| 0.748611111111111 | 22.374 |
| 0.7493055555555556 | 21.636 |
| 0.75 | 20.967 |
| 0.7506944444444444 | 20.483 |
| 0.751388888888889 | 20.056 |
| 0.7520833333333333 | 19.445 |
| 0.7527777777777778 | 18.765 |
| 0.7534722222222222 | 18.142 |
| 0.7541666666666668 | 17.554 |
| 0.7548611111111111 | 16.896 |
| 0.7555555555555555 | 16.181 |
| 0.75625 | 15.489 |
| 0.7569444444444445 | 14.855 |
| 0.7576388888888889 | 14.186 |
| 0.7583333333333333 | 13.471 |
| 0.7590277777777777 | 12.791 |
| 0.7597222222222223 | 12.052 |
| 0.7604166666666666 | 11.326 |
| 0.7611111111111111 | 10.68 |
| 0.7618055555555556 | 10.15 |
| 0.7625000000000001 | 9.757 |
| 0.7631944444444444 | 9.734 |
| 0.7638888888888888 | 9.642 |
| 0.7645833333333334 | 9.285 |
| 0.7652777777777778 | 8.858 |
| 0.7659722222222222 | 8.696 |
| 0.7666666666666666 | 9.169 |
| 0.7673611111111112 | 9.884 |
| 0.7680555555555556 | 9.896 |
| 0.7687499999999999 | 8.962 |
| 0.7694444444444444 | 7.947 |
| 0.7701388888888889 | 7.762 |
| 0.7708333333333334 | 7.762 |
| 0.7715277777777777 | 7.67 |
| 0.7722222222222223 | 7.601 |
| 0.7729166666666667 | 7.347 |
| 0.7736111111111111 | 7.001 |
| 0.7743055555555555 | 6.47 |
| 0.775 | 5.813 |
| 0.7756944444444445 | 5.213 |
| 0.7763888888888889 | 4.775 |
| 0.7770833333333332 | 4.371 |
| 0.7777777777777778 | 4.06 |
| 0.7784722222222222 | 3.748 |
| 0.7791666666666667 | 3.506 |
| 0.779861111111111 | 3.195 |
| 0.7805555555555556 | 2.918 |
| 0.78125 | 2.734 |
| 0.7819444444444444 | 2.503 |
| 0.782638888888889 | 2.261 |
| 0.7833333333333333 | 2.065 |
| 0.7840277777777778 | 1.915 |
| 0.7847222222222222 | 1.753 |
| 0.7854166666666668 | 1.557 |
| 0.7861111111111111 | 1.396 |
| 0.7868055555555555 | 1.269 |
| 0.7875 | 1.119 |
| 0.7881944444444445 | 0.9 |
| 0.7888888888888889 | 0.692 |
| 0.7895833333333333 | 0.623 |
| 0.7902777777777777 | 0.508 |
| 0.7909722222222223 | 0.415 |
| 0.7916666666666666 | 0.358 |
| 0.7923611111111111 | 0.3 |
| 0.7930555555555556 | 0.173 |
| 0.7937500000000001 | 0.081 |
| 0.7944444444444444 | 0.012 |
| 0.7951388888888888 | -0.081 |
| 0.7958333333333334 | -0.161 |
| 0.7965277777777778 | -0.138 |
| 0.7972222222222222 | -0.138 |
| 0.7979166666666666 | -0.161 |
| 0.7986111111111112 | -0.265 |
| 0.7993055555555556 | -0.3 |
| 0.7999999999999999 | -0.288 |
| 0.8006944444444444 | -0.3 |
| 0.8013888888888889 | -0.358 |
| 0.8020833333333334 | -0.323 |
| 0.8027777777777777 | -0.415 |
| 0.8034722222222223 | -0.427 |
| 0.8041666666666667 | -0.461 |
| 0.8048611111111111 | -0.415 |
| 0.8055555555555555 | -0.358 |
| 0.80625 | -0.323 |
| 0.8069444444444445 | -0.381 |
| 0.8076388888888889 | -0.392 |
| 0.8083333333333332 | -0.461 |
| 0.8090277777777778 | -0.358 |
| 0.8097222222222222 | -0.392 |
| 0.8104166666666667 | -0.427 |
| 0.811111111111111 | -0.438 |
| 0.8118055555555556 | -0.404 |
| 0.8125 | -0.369 |
| 0.8131944444444444 | -0.323 |
| 0.813888888888889 | -0.358 |
| 0.8145833333333333 | -0.369 |
| 0.8152777777777778 | -0.346 |
| 0.8159722222222222 | -0.358 |
| 0.8166666666666668 | -0.323 |
| 0.8173611111111111 | -0.346 |
| 0.8180555555555555 | -0.335 |
| 0.81875 | -0.335 |
| 0.8194444444444445 | -0.404 |
| 0.8201388888888889 | -0.415 |
| 0.8208333333333333 | -0.335 |
| 0.8215277777777777 | -0.381 |
| 0.8222222222222223 | -0.392 |
| 0.8229166666666666 | -0.404 |
| 0.8236111111111111 | -0.358 |
| 0.8243055555555556 | -0.392 |
| 0.8250000000000001 | -0.427 |
| 0.8256944444444444 | -0.392 |
| 0.8263888888888888 | -0.45 |
| 0.8270833333333334 | -0.461 |
| 0.8277777777777778 | -0.404 |
| 0.8284722222222222 | -0.438 |
| 0.8291666666666666 | -0.427 |
| 0.8298611111111112 | -0.392 |
| 0.8305555555555556 | -0.415 |
| 0.8312499999999999 | -0.369 |
| 0.8319444444444444 | -0.369 |
| 0.8326388888888889 | -0.369 |
| 0.8333333333333334 | -0.381 |
| 0.8340277777777777 | -0.404 |
| 0.8347222222222223 | -0.381 |
| 0.8354166666666667 | -0.404 |
| 0.8361111111111111 | -0.438 |
| 0.8368055555555555 | -0.381 |
| 0.8375 | -0.346 |
| 0.8381944444444445 | -0.358 |
| 0.8388888888888889 | -0.346 |
| 0.8395833333333332 | -0.312 |
| 0.8402777777777778 | -0.335 |
| 0.8409722222222222 | -0.346 |
| 0.8416666666666667 | -0.358 |
| 0.842361111111111 | -0.323 |
| 0.8430555555555556 | -0.312 |
| 0.84375 | -0.288 |
| 0.8444444444444444 | -0.3 |
| 0.845138888888889 | -0.346 |
| 0.8458333333333333 | -0.254 |
| 0.8465277777777778 | -0.265 |
| 0.8472222222222222 | -0.312 |
| 0.8479166666666668 | -0.312 |
| 0.8486111111111111 | -0.3 |
| 0.8493055555555555 | -0.254 |
| 0.85 | -0.277 |
| 0.8506944444444445 | -0.3 |
| 0.8513888888888889 | -0.242 |
| 0.8520833333333333 | -0.265 |
| 0.8527777777777777 | -0.231 |
| 0.8534722222222223 | -0.3 |
| 0.8541666666666666 | -0.288 |
| 0.8548611111111111 | -0.265 |
| 0.8555555555555556 | -0.277 |
| 0.8562500000000001 | -0.312 |
| 0.8569444444444444 | -0.323 |
| 0.8576388888888888 | -0.335 |
| 0.8583333333333334 | -0.312 |
| 0.8590277777777778 | -0.312 |
| 0.8597222222222222 | -0.312 |
| 0.8604166666666666 | -0.312 |
| 0.8611111111111112 | -0.358 |
| 0.8618055555555556 | -0.288 |
| 0.8624999999999999 | -0.312 |
| 0.8631944444444444 | -0.312 |
| 0.8638888888888889 | -0.3 |
| 0.8645833333333334 | -0.323 |
| 0.8652777777777777 | -0.3 |
| 0.8659722222222223 | -0.288 |
| 0.8666666666666667 | -0.346 |
| 0.8673611111111111 | -0.335 |
| 0.8680555555555555 | -0.3 |
| 0.86875 | -0.335 |
| 0.8694444444444445 | -0.323 |
| 0.8701388888888889 | -0.312 |
| 0.8708333333333332 | -0.3 |
| 0.8715277777777778 | -0.323 |
| 0.8722222222222222 | -0.323 |
| 0.8729166666666667 | -0.335 |
| 0.873611111111111 | -0.335 |
| 0.8743055555555556 | -0.358 |
| 0.875 | -0.335 |
| 0.8756944444444444 | -0.392 |
| 0.876388888888889 | -0.392 |
| 0.8770833333333333 | -0.404 |
| 0.8777777777777778 | -0.335 |
| 0.8784722222222222 | -0.312 |
| 0.8791666666666668 | -0.358 |
| 0.8798611111111111 | -0.392 |
| 0.8805555555555555 | -0.415 |
| 0.88125 | -0.404 |
| 0.8819444444444445 | -0.369 |
| 0.8826388888888889 | -0.438 |
| 0.8833333333333333 | -0.404 |
| 0.8840277777777777 | -0.335 |
| 0.8847222222222223 | -0.358 |
| 0.8854166666666666 | -0.404 |
| 0.8861111111111111 | -0.392 |
| 0.8868055555555556 | -0.392 |
| 0.8875000000000001 | -0.335 |
| 0.8881944444444444 | -0.381 |
| 0.8888888888888888 | -0.358 |
| 0.8895833333333334 | -0.312 |
| 0.8902777777777778 | -0.369 |
| 0.8909722222222222 | -0.369 |
| 0.8916666666666666 | -0.346 |
| 0.8923611111111112 | -0.392 |
| 0.8930555555555556 | -0.369 |
| 0.8937499999999999 | -0.358 |
| 0.8944444444444444 | -0.335 |
| 0.8951388888888889 | -0.323 |
| 0.8958333333333334 | -0.404 |
| 0.8965277777777777 | -0.346 |
| 0.8972222222222223 | -0.335 |
| 0.8979166666666667 | -0.358 |
| 0.8986111111111111 | -0.312 |
| 0.8993055555555555 | -0.358 |
| 0.9 | -0.346 |
| 0.9006944444444445 | -0.381 |
| 0.9013888888888889 | -0.45 |
| 0.9020833333333332 | -0.381 |
| 0.9027777777777778 | -0.381 |
| 0.9034722222222222 | -0.427 |
| 0.9041666666666667 | -0.404 |
| 0.904861111111111 | -0.438 |
| 0.9055555555555556 | -0.358 |
| 0.90625 | -0.415 |
| 0.9069444444444444 | -0.415 |
| 0.907638888888889 | -0.358 |
| 0.9083333333333333 | -0.404 |
| 0.9090277777777778 | -0.346 |
| 0.9097222222222222 | -0.381 |
| 0.9104166666666668 | -0.381 |
| 0.9111111111111111 | -0.358 |
| 0.9118055555555555 | -0.346 |
| 0.9125 | -0.3 |
| 0.9131944444444445 | -0.265 |
| 0.9138888888888889 | -0.254 |
| 0.9145833333333333 | -0.288 |
| 0.9152777777777777 | -0.277 |
| 0.9159722222222223 | -0.254 |
| 0.9166666666666666 | -0.219 |
| 0.9173611111111111 | -0.312 |
| 0.9180555555555556 | -0.265 |
| 0.9187500000000001 | -0.265 |
| 0.9194444444444444 | -0.265 |
| 0.9201388888888888 | -0.254 |
| 0.9208333333333334 | -0.265 |
| 0.9215277777777778 | -0.254 |
| 0.9222222222222222 | -0.277 |
| 0.9229166666666666 | -0.254 |
| 0.9236111111111112 | -0.208 |
| 0.9243055555555556 | -0.196 |
| 0.9249999999999999 | -0.231 |
| 0.9256944444444444 | -0.162 |
| 0.9263888888888889 | -0.196 |
| 0.9270833333333334 | -0.185 |
| 0.9277777777777777 | -0.208 |
| 0.9284722222222223 | -0.208 |
| 0.9291666666666667 | -0.219 |
| 0.9298611111111111 | -0.265 |
| 0.9305555555555555 | -0.277 |
| 0.93125 | -0.265 |
| 0.9319444444444445 | -0.242 |
| 0.9326388888888889 | -0.242 |
| 0.9333333333333332 | -0.231 |
| 0.9340277777777778 | -0.219 |
| 0.9347222222222222 | -0.242 |
| 0.9354166666666667 | -0.265 |
| 0.936111111111111 | -0.265 |
| 0.9368055555555556 | -0.242 |
| 0.9375 | -0.242 |
| 0.9381944444444444 | -0.219 |
| 0.938888888888889 | -0.288 |
| 0.9395833333333333 | -0.173 |
| 0.9402777777777778 | -0.208 |
| 0.9409722222222222 | -0.242 |
| 0.9416666666666668 | -0.242 |
| 0.9423611111111111 | -0.288 |
| 0.9430555555555555 | -0.242 |
| 0.94375 | -0.3 |
| 0.9444444444444445 | -0.242 |
| 0.9451388888888889 | -0.312 |
| 0.9458333333333333 | -0.277 |
| 0.9465277777777777 | -0.288 |
| 0.9472222222222223 | -0.3 |
| 0.9479166666666666 | -0.323 |
| 0.9486111111111111 | -0.369 |
| 0.9493055555555556 | -0.323 |
| 0.9500000000000001 | -0.312 |
| 0.9506944444444444 | -0.312 |
| 0.9513888888888888 | -0.323 |
| 0.9520833333333334 | -0.3 |
| 0.9527777777777778 | -0.346 |
| 0.9534722222222222 | -0.288 |
| 0.9541666666666666 | -0.312 |
| 0.9548611111111112 | -0.3 |
| 0.9555555555555556 | -0.312 |
| 0.9562499999999999 | -0.312 |
| 0.9569444444444444 | -0.3 |
| 0.9576388888888889 | -0.265 |
| 0.9583333333333334 | -0.265 |
| 0.9590277777777777 | -0.3 |
| 0.9597222222222223 | -0.312 |
| 0.9604166666666667 | -0.312 |
| 0.9611111111111111 | -0.335 |
| 0.9618055555555555 | -0.312 |
| 0.9625 | -0.392 |
| 0.9631944444444445 | -0.358 |
| 0.9638888888888889 | -0.381 |
| 0.9645833333333332 | -0.358 |
| 0.9652777777777778 | -0.335 |
| 0.9659722222222222 | -0.335 |
| 0.9666666666666667 | -0.358 |
| 0.967361111111111 | -0.346 |
| 0.9680555555555556 | -0.312 |
| 0.96875 | -0.335 |
| 0.9694444444444444 | -0.358 |
| 0.970138888888889 | -0.312 |
| 0.9708333333333333 | -0.323 |
| 0.9715277777777778 | -0.369 |
| 0.9722222222222222 | -0.323 |
| 0.9729166666666668 | -0.312 |
| 0.9736111111111111 | -0.3 |
| 0.9743055555555555 | -0.254 |
| 0.975 | -0.288 |
| 0.9756944444444445 | -0.3 |
| 0.9763888888888889 | -0.288 |
| 0.9770833333333333 | -0.254 |
| 0.9777777777777777 | -0.196 |
| 0.9784722222222223 | -0.196 |
| 0.9791666666666666 | -0.173 |
| 0.9798611111111111 | -0.231 |
| 0.9805555555555556 | -0.185 |
| 0.9812500000000001 | -0.173 |
| 0.9819444444444444 | -0.185 |
| 0.9826388888888888 | -0.173 |
| 0.9833333333333334 | -0.138 |
| 0.9840277777777778 | -0.138 |
| 0.9847222222222222 | -0.15 |
| 0.9854166666666666 | -0.196 |
| 0.9861111111111112 | -0.196 |
| 0.9868055555555556 | -0.185 |
| 0.9874999999999999 | -0.219 |
| 0.9881944444444444 | -0.242 |
| 0.9888888888888889 | -0.231 |
| 0.9895833333333334 | -0.289 |
| 0.9902777777777777 | -0.254 |
| 0.9909722222222223 | -0.277 |
| 0.9916666666666667 | -0.254 |
| 0.9923611111111111 | -0.312 |
| 0.9930555555555555 | -0.289 |
| 0.99375 | -0.346 |
| 0.9944444444444445 | -0.312 |
| 0.9951388888888889 | -0.242 |
| 0.9958333333333332 | -0.265 |
| 0.9965277777777778 | -0.265 |
| 0.9972222222222222 | -0.289 |
| 0.9979166666666667 | -0.3 |
| 0.998611111111111 | -0.3 |
| 0.9993055555555556 | -0.254 |